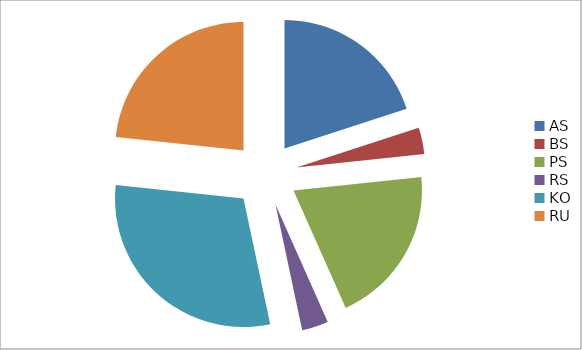
| Category | Series 0 |
|---|---|
| AS | 6 |
| BS | 1 |
| PS | 6 |
| RS | 1 |
| KO | 9 |
| RU | 7 |